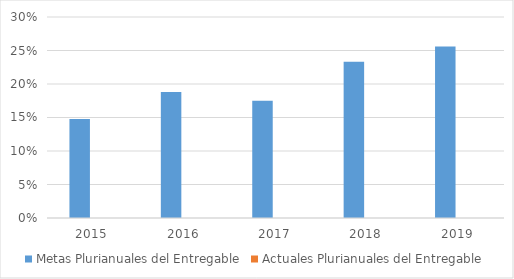
| Category | Metas Plurianuales del Entregable | Actuales Plurianuales del Entregable |
|---|---|---|
| 2015.0 | 0.148 | 0 |
| 2016.0 | 0.188 | 0 |
| 2017.0 | 0.175 | 0 |
| 2018.0 | 0.233 | 0 |
| 2019.0 | 0.256 | 0 |